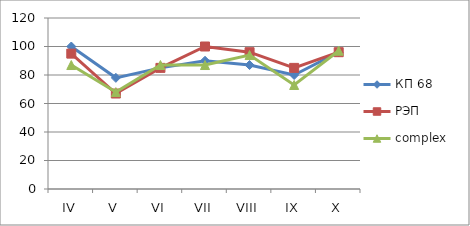
| Category | КП 68 | РЭП  | complex |
|---|---|---|---|
| IV | 100 | 95 | 87 |
| V | 78 | 67 | 68 |
| VI | 85 | 85 | 87 |
| VII | 90 | 100 | 87 |
| VIII | 87 | 96 | 94 |
| IX | 80 | 85 | 73 |
| X | 96 | 96 | 97 |